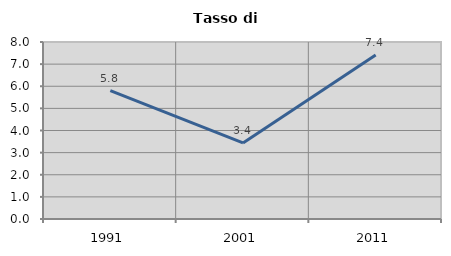
| Category | Tasso di disoccupazione   |
|---|---|
| 1991.0 | 5.8 |
| 2001.0 | 3.441 |
| 2011.0 | 7.417 |